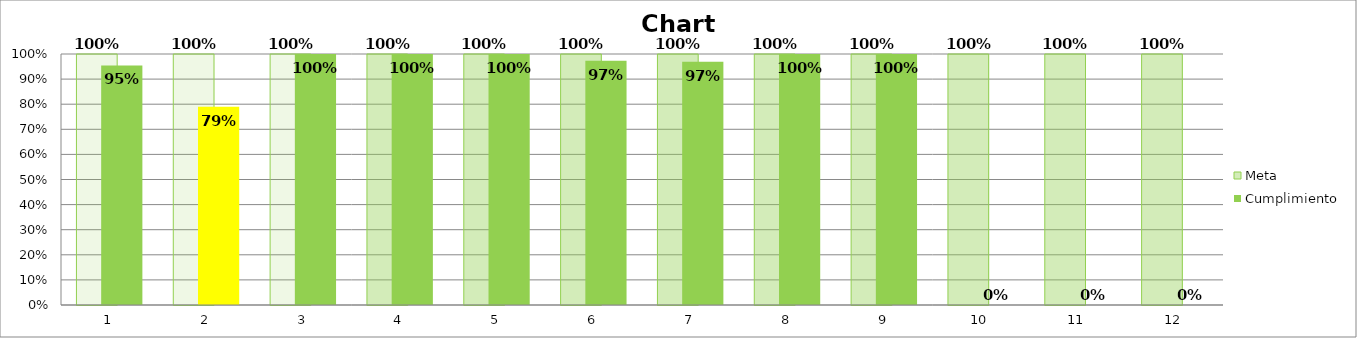
| Category | Meta | Cumplimiento |
|---|---|---|
| 0 | 1 | 0.955 |
| 1 | 1 | 0.789 |
| 2 | 1 | 1 |
| 3 | 1 | 1 |
| 4 | 1 | 1 |
| 5 | 1 | 0.973 |
| 6 | 1 | 0.969 |
| 7 | 1 | 1 |
| 8 | 1 | 1 |
| 9 | 1 | 0 |
| 10 | 1 | 0 |
| 11 | 1 | 0 |